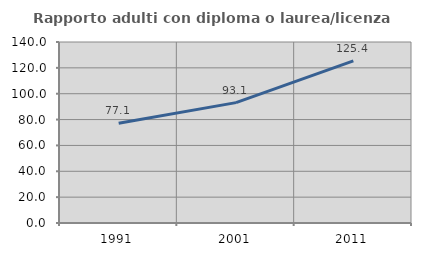
| Category | Rapporto adulti con diploma o laurea/licenza media  |
|---|---|
| 1991.0 | 77.077 |
| 2001.0 | 93.116 |
| 2011.0 | 125.352 |